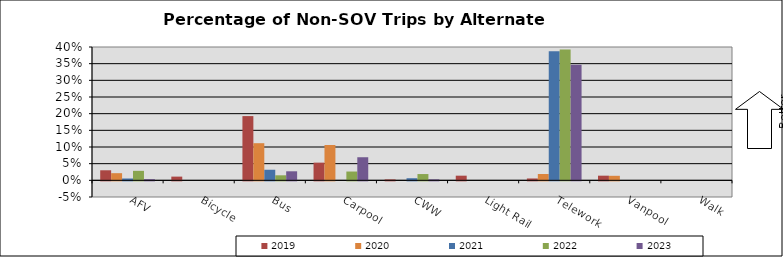
| Category | 2019 | 2020 | 2021 | 2022 | 2023 |
|---|---|---|---|---|---|
| AFV | 0.03 | 0.021 | 0.006 | 0.028 | 0.003 |
| Bicycle | 0.011 | 0 | 0 | 0 | 0 |
| Bus | 0.193 | 0.111 | 0.032 | 0.015 | 0.027 |
| Carpool | 0.053 | 0.106 | 0 | 0.026 | 0.069 |
| CWW | 0.003 | 0 | 0.006 | 0.019 | 0.003 |
| Light Rail | 0.014 | 0 | 0 | 0 | 0 |
| Telework | 0.006 | 0.019 | 0.387 | 0.392 | 0.346 |
| Vanpool | 0.014 | 0.014 | 0 | 0 | 0 |
| Walk | 0 | 0 | 0 | 0 | 0 |